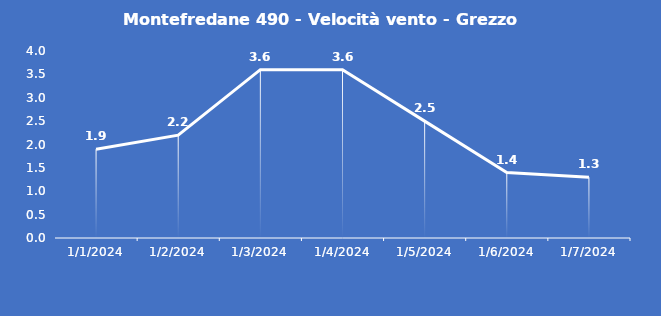
| Category | Montefredane 490 - Velocità vento - Grezzo (m/s) |
|---|---|
| 1/1/24 | 1.9 |
| 1/2/24 | 2.2 |
| 1/3/24 | 3.6 |
| 1/4/24 | 3.6 |
| 1/5/24 | 2.5 |
| 1/6/24 | 1.4 |
| 1/7/24 | 1.3 |